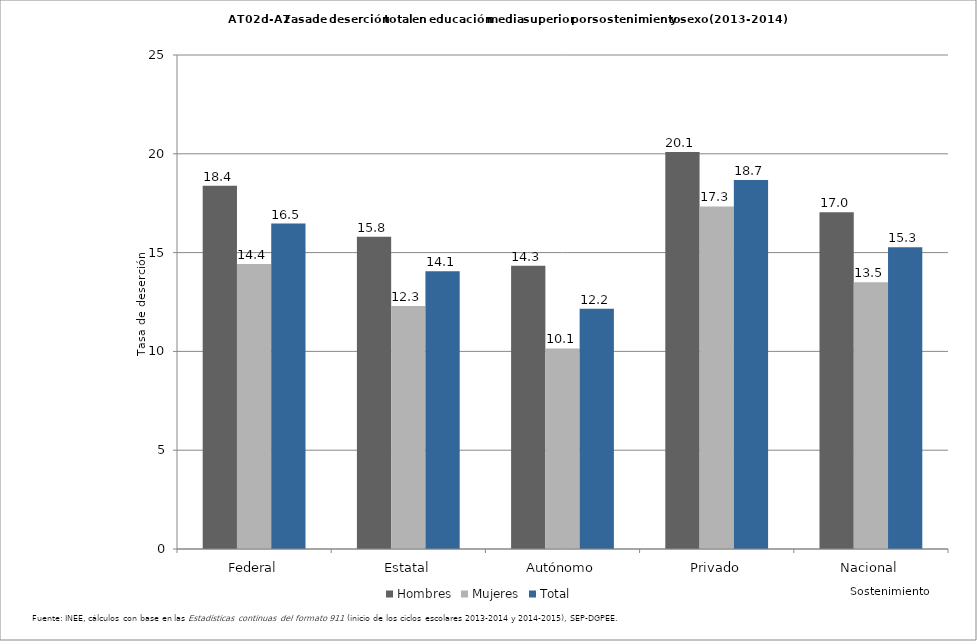
| Category | Hombres | Mujeres | Total |
|---|---|---|---|
| Federal | 18.383 | 14.423 | 16.468 |
| Estatal | 15.802 | 12.295 | 14.059 |
| Autónomo | 14.336 | 10.147 | 12.154 |
| Privado | 20.091 | 17.338 | 18.675 |
| Nacional | 17.042 | 13.501 | 15.27 |